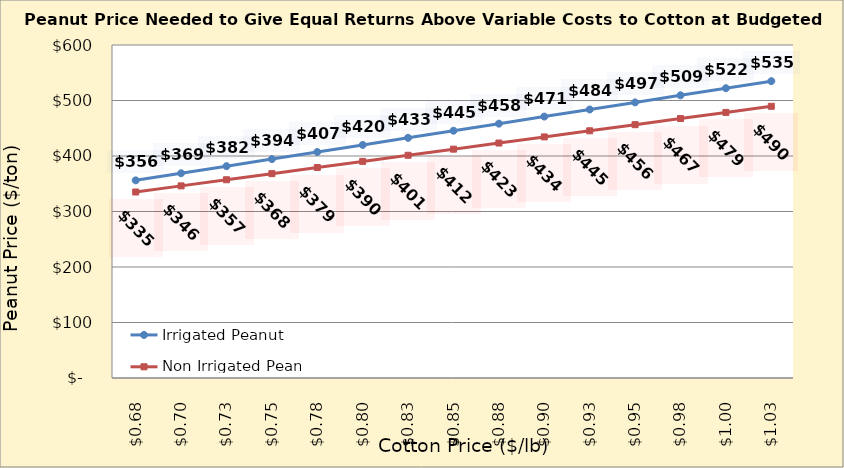
| Category | Irrigated Peanut | Non Irrigated Peanut |
|---|---|---|
| 0.6749999999999998 | 356.136 | 335.129 |
| 0.6999999999999998 | 368.902 | 346.158 |
| 0.7249999999999999 | 381.668 | 357.187 |
| 0.7499999999999999 | 394.434 | 368.217 |
| 0.7749999999999999 | 407.2 | 379.246 |
| 0.7999999999999999 | 419.966 | 390.276 |
| 0.825 | 432.732 | 401.305 |
| 0.85 | 445.498 | 412.334 |
| 0.875 | 458.264 | 423.364 |
| 0.9 | 471.03 | 434.393 |
| 0.925 | 483.796 | 445.423 |
| 0.9500000000000001 | 496.562 | 456.452 |
| 0.9750000000000001 | 509.328 | 467.482 |
| 1.0 | 522.094 | 478.511 |
| 1.025 | 534.86 | 489.54 |